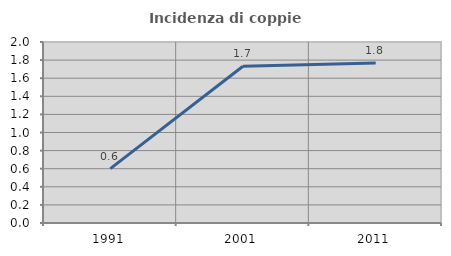
| Category | Incidenza di coppie miste |
|---|---|
| 1991.0 | 0.601 |
| 2001.0 | 1.732 |
| 2011.0 | 1.768 |